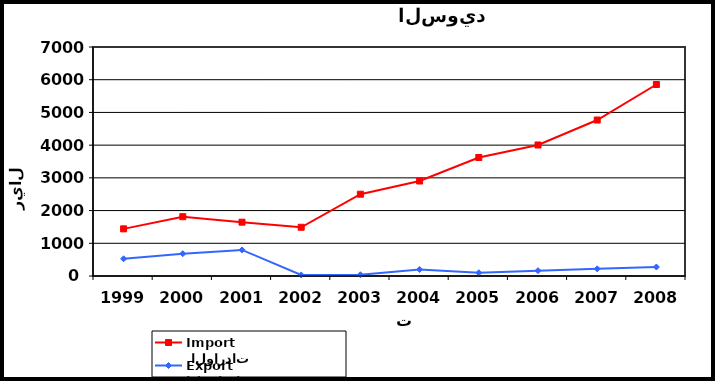
| Category |  الواردات           Import | الصادرات          Export |
|---|---|---|
| 1999.0 | 1441 | 525 |
| 2000.0 | 1813 | 682 |
| 2001.0 | 1645 | 797 |
| 2002.0 | 1490 | 32 |
| 2003.0 | 2500 | 38 |
| 2004.0 | 2904 | 199 |
| 2005.0 | 3622 | 99 |
| 2006.0 | 4004 | 163 |
| 2007.0 | 4768 | 219 |
| 2008.0 | 5854 | 275 |